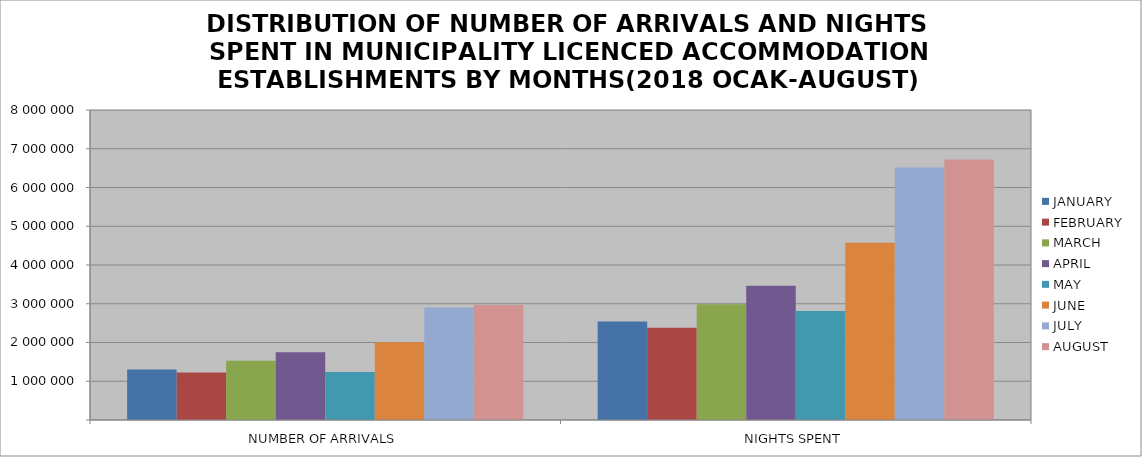
| Category | JANUARY | FEBRUARY | MARCH | APRIL | MAY | JUNE | JULY | AUGUST |
|---|---|---|---|---|---|---|---|---|
| NUMBER OF ARRIVALS | 1303353 | 1223475 | 1526172 | 1749085 | 1240889 | 2003881 | 2904028 | 2966995 |
| NIGHTS SPENT | 2542103 | 2381300 | 2986820 | 3463261 | 2810808 | 4572629 | 6517690 | 6721558 |